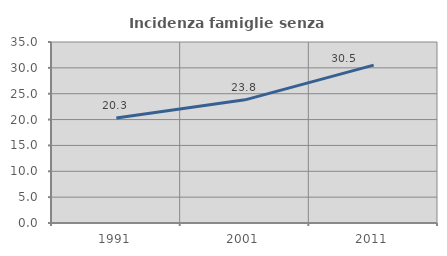
| Category | Incidenza famiglie senza nuclei |
|---|---|
| 1991.0 | 20.294 |
| 2001.0 | 23.817 |
| 2011.0 | 30.525 |